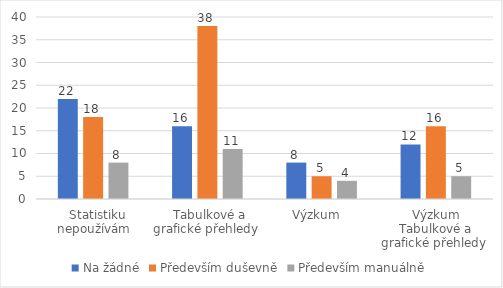
| Category | Na žádné | Především duševně | Především manuálně |
|---|---|---|---|
|   Statistiku nepoužívám | 22 | 18 | 8 |
|  Tabulkové a grafické přehledy  | 16 | 38 | 11 |
| Výzkum   | 8 | 5 | 4 |
| Výzkum Tabulkové a grafické přehledy  | 12 | 16 | 5 |